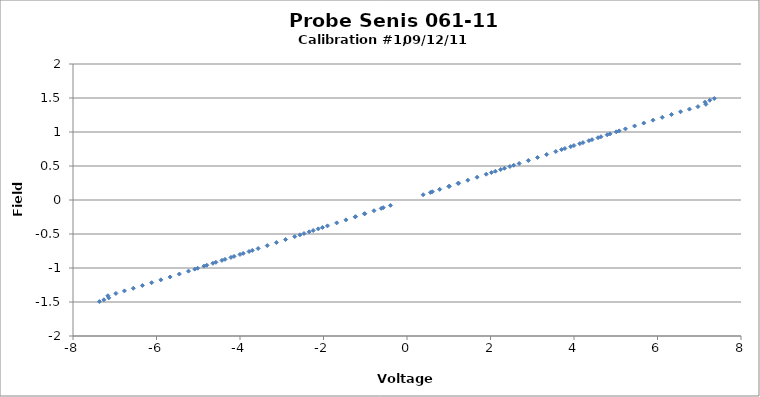
| Category | Series 0 |
|---|---|
| 7.360389 | 1.493 |
| 7.252596 | 1.467 |
| 7.136952 | 1.438 |
| 7.159215 | 1.407 |
| 6.967955 | 1.373 |
| 6.764613 | 1.336 |
| 6.552204 | 1.298 |
| 6.334269 | 1.257 |
| 6.113733 | 1.216 |
| 5.892637 | 1.174 |
| 5.671779 | 1.131 |
| 5.451532 | 1.089 |
| 5.23202 | 1.046 |
| 5.012898 | 1.003 |
| 4.794268 | 0.96 |
| 4.576023 | 0.916 |
| 4.358044 | 0.873 |
| 4.140133 | 0.829 |
| 3.921938 | 0.785 |
| 3.703548 | 0.742 |
| -7.367764 | -1.494 |
| -7.259559 | -1.468 |
| -7.142713 | -1.439 |
| -7.164854 | -1.408 |
| -6.972608 | -1.374 |
| -6.768734 | -1.337 |
| -6.555866 | -1.298 |
| -6.337459 | -1.258 |
| -6.116581 | -1.216 |
| -5.895263 | -1.174 |
| -5.674385 | -1.132 |
| -5.453908 | -1.089 |
| -5.23413 | -1.046 |
| -5.014881 | -1.003 |
| -4.796034 | -0.96 |
| -4.577725 | -0.916 |
| -4.359645 | -0.873 |
| -4.14161 | -0.829 |
| -3.923304 | -0.785 |
| -3.704788 | -0.742 |
| 5.081406 | 1.016 |
| 4.862266 | 0.973 |
| 4.646518 | 0.93 |
| 4.430935 | 0.887 |
| 4.214602 | 0.844 |
| 3.998016 | 0.801 |
| 3.780984 | 0.757 |
| 3.563318 | 0.713 |
| 3.345095 | 0.669 |
| 3.126123 | 0.625 |
| 2.90668 | 0.581 |
| 2.686545 | 0.537 |
| 2.46566 | 0.493 |
| 2.244285 | 0.448 |
| 2.022156 | 0.404 |
| -5.083081 | -1.016 |
| -4.864047 | -0.973 |
| -4.648381 | -0.93 |
| -4.432779 | -0.887 |
| -4.216511 | -0.844 |
| -4.000007 | -0.801 |
| -3.782962 | -0.757 |
| -3.565297 | -0.714 |
| -3.347071 | -0.67 |
| -3.128028 | -0.626 |
| -2.908505 | -0.582 |
| -2.688374 | -0.537 |
| -2.467426 | -0.493 |
| -2.24601 | -0.449 |
| -2.023817 | -0.404 |
| 2.556218 | 0.511 |
| 2.335541 | 0.467 |
| 2.117343 | 0.423 |
| 1.898348 | 0.379 |
| 1.678313 | 0.335 |
| 1.457263 | 0.291 |
| 1.235384 | 0.247 |
| 1.012813 | 0.202 |
| -2.562988 | -0.512 |
| -2.342543 | -0.468 |
| -2.124237 | -0.424 |
| -1.904923 | -0.38 |
| -1.684483 | -0.336 |
| -1.462996 | -0.292 |
| -1.240685 | -0.248 |
| -1.017738 | -0.203 |
| 1.224516 | 0.245 |
| 1.003033 | 0.2 |
| 0.78314 | 0.156 |
| 0.562106 | 0.112 |
| -1.23301 | -0.246 |
| -1.011331 | -0.202 |
| -0.790676 | -0.158 |
| -0.568882 | -0.113 |
| 0.607926 | 0.121 |
| 0.3874 | 0.077 |
| -0.617348 | -0.123 |
| -0.395788 | -0.079 |